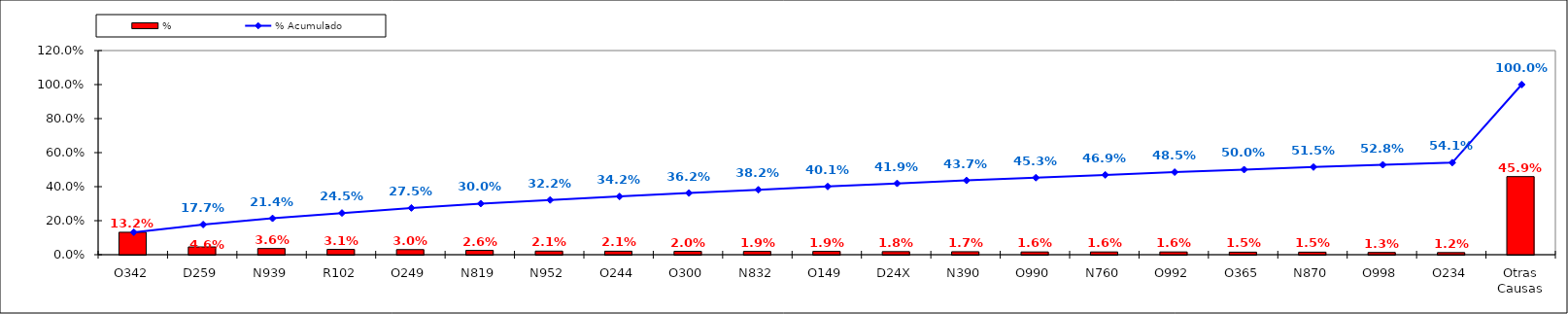
| Category | % |
|---|---|
| O342 | 0.132 |
| D259 | 0.046 |
| N939 | 0.036 |
| R102 | 0.031 |
| O249 | 0.03 |
| N819 | 0.026 |
| N952 | 0.021 |
| O244 | 0.021 |
| O300 | 0.02 |
| N832 | 0.019 |
| O149 | 0.019 |
| D24X | 0.018 |
| N390 | 0.017 |
| O990 | 0.016 |
| N760 | 0.016 |
| O992 | 0.016 |
| O365 | 0.015 |
| N870 | 0.015 |
| O998 | 0.013 |
| O234 | 0.012 |
| Otras Causas | 0.459 |